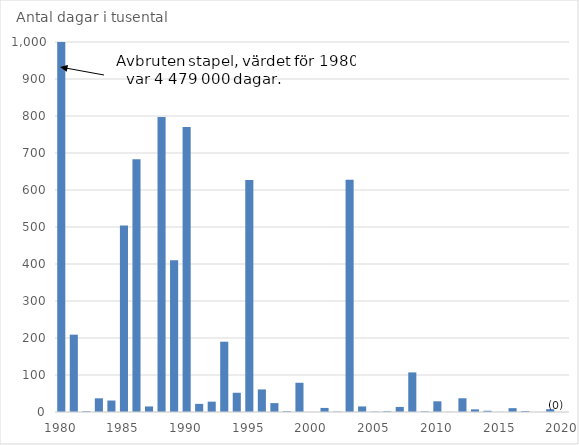
| Category | Antal dagar i tusental |
|---|---|
| 1980.0 | 1000 |
| nan | 209 |
| nan | 2 |
| nan | 37 |
| nan | 31 |
| 1985.0 | 504 |
| nan | 683 |
| nan | 15 |
| nan | 797 |
| nan | 410 |
| 1990.0 | 770 |
| nan | 22 |
| nan | 28 |
| nan | 190 |
| nan | 52 |
| 1995.0 | 627 |
| nan | 61 |
| nan | 24 |
| nan | 2 |
| nan | 79 |
| 2000.0 | 0 |
| nan | 11 |
| nan | 1 |
| nan | 628 |
| nan | 15 |
| 2005.0 | 1 |
| nan | 2 |
| nan | 13.7 |
| nan | 107 |
| nan | 1.6 |
| 2010.0 | 28.9 |
| nan | 0.254 |
| nan | 37.1 |
| nan | 7.1 |
| nan | 3.4 |
| 2015.0 | 0.234 |
| nan | 10.417 |
| nan | 2.57 |
| nan | 0.05 |
| nan | 7.58 |
| 2020.0 | 0 |